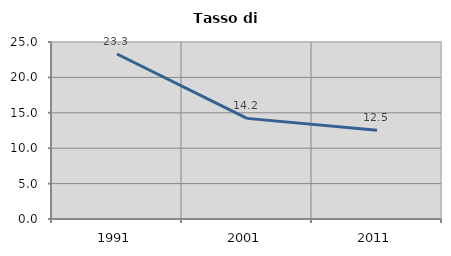
| Category | Tasso di disoccupazione   |
|---|---|
| 1991.0 | 23.307 |
| 2001.0 | 14.213 |
| 2011.0 | 12.523 |